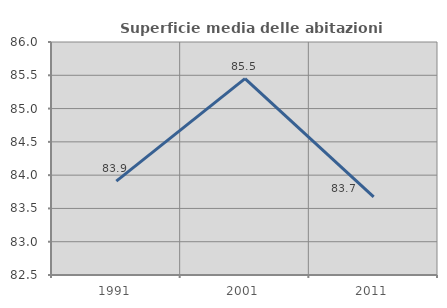
| Category | Superficie media delle abitazioni occupate |
|---|---|
| 1991.0 | 83.909 |
| 2001.0 | 85.451 |
| 2011.0 | 83.674 |